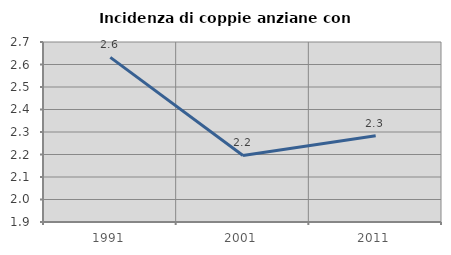
| Category | Incidenza di coppie anziane con figli |
|---|---|
| 1991.0 | 2.632 |
| 2001.0 | 2.196 |
| 2011.0 | 2.283 |